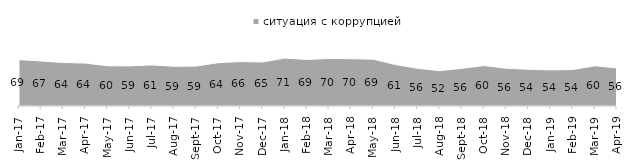
| Category | ситуация с коррупцией |
|---|---|
| 2017-01-01 | 68.7 |
| 2017-02-01 | 66.7 |
| 2017-03-01 | 64.45 |
| 2017-04-01 | 63.55 |
| 2017-05-01 | 59.55 |
| 2017-06-01 | 59.4 |
| 2017-07-01 | 60.85 |
| 2017-08-01 | 58.85 |
| 2017-09-01 | 59.1 |
| 2017-10-01 | 64.15 |
| 2017-11-01 | 65.8 |
| 2017-12-01 | 65.2 |
| 2018-01-01 | 70.95 |
| 2018-02-01 | 69 |
| 2018-03-01 | 70.4 |
| 2018-04-01 | 70 |
| 2018-05-01 | 69.35 |
| 2018-06-01 | 61.35 |
| 2018-07-01 | 55.75 |
| 2018-08-01 | 52.3 |
| 2018-09-01 | 55.85 |
| 2018-10-01 | 59.9 |
| 2018-11-01 | 55.938 |
| 2018-12-01 | 54.35 |
| 2019-01-01 | 53.5 |
| 2019-02-01 | 54 |
| 2019-03-01 | 59.523 |
| 2019-04-01 | 56.386 |